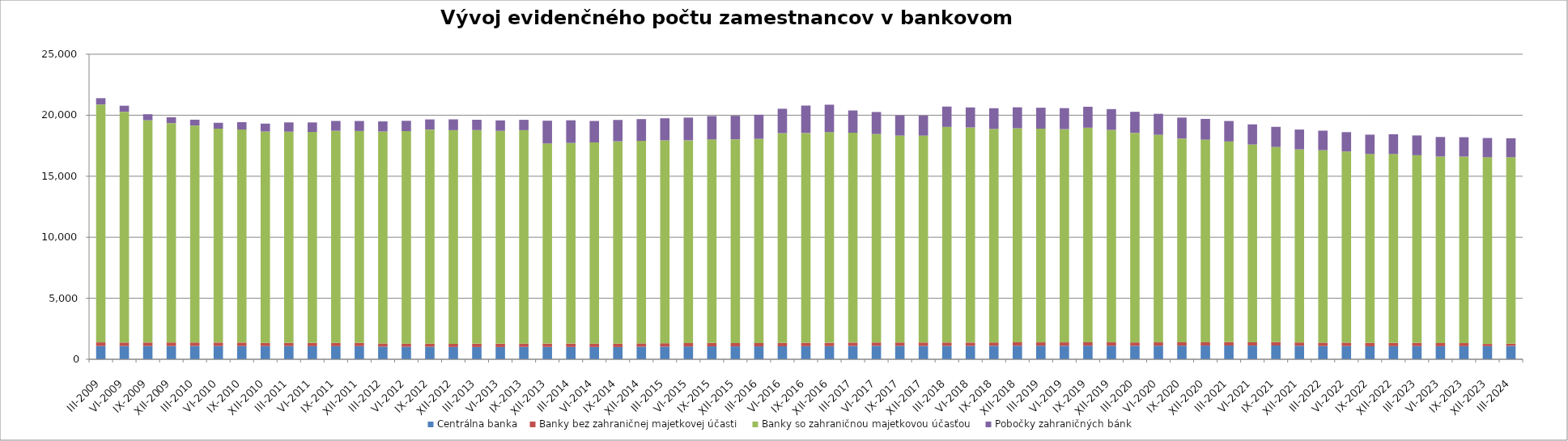
| Category | Centrálna banka  | Banky bez zahraničnej majetkovej účasti  | Banky so zahraničnou majetkovou účasťou  | Pobočky zahraničných bánk  |
|---|---|---|---|---|
| III-2009 | 1084 | 301 | 19495 | 518 |
| VI-2009 | 1086 | 286 | 18910 | 498 |
| IX-2009 | 1088 | 285 | 18218 | 490 |
| XII-2009 | 1086 | 291 | 17975 | 484 |
| III-2010 | 1089 | 286 | 17776 | 483 |
| VI-2010 | 1085 | 284 | 17526 | 485 |
| IX-2010 | 1083 | 285 | 17461 | 600 |
| XII-2010 | 1079 | 264 | 17323 | 647 |
| III-2011 | 1082 | 261 | 17308 | 760 |
| VI-2011 | 1070 | 267 | 17294 | 779 |
| IX-2011 | 1072 | 270 | 17382 | 807 |
| XII-2011 | 1075 | 267 | 17366 | 819 |
| III-2012 | 1033 | 265 | 17369 | 827 |
| VI-2012 | 1020 | 263 | 17416 | 843 |
| IX-2012 | 1021 | 257 | 17545 | 833 |
| XII-2012 | 1007 | 253 | 17516 | 886 |
| III-2013 | 1003 | 268 | 17511 | 846 |
| VI-2013 | 1001 | 268 | 17451 | 856 |
| IX-2013 | 1013 | 271 | 17492 | 847 |
| XII-2013 | 1011 | 275 | 16399 | 1866 |
| III-2014 | 1008 | 277 | 16442 | 1857 |
| VI-2014 | 1007 | 273 | 16492 | 1758 |
| IX-2014 | 1001 | 277 | 16584 | 1751 |
| XII-2014 | 1027 | 274 | 16596 | 1786 |
| III-2015 | 1034 | 280 | 16627 | 1811 |
| VI-2015 | 1049 | 279 | 16615 | 1862 |
| IX-2015 | 1056 | 280 | 16680 | 1915 |
| XII-2015 | 1053 | 277 | 16696 | 1927 |
| III-2016 | 1055 | 277 | 16734 | 1973 |
| VI-2016 | 1063 | 279 | 17191 | 1999 |
| IX-2016 | 1072 | 284 | 17186 | 2249 |
| XII-2016 | 1075 | 277 | 17261 | 2250 |
| III-2017 | 1094 | 275 | 17199 | 1821 |
| VI-2017 | 1102 | 275 | 17084 | 1803 |
| IX-2017 | 1101 | 276 | 16954 | 1662 |
| XII-2017 | 1093 | 282 | 16953 | 1644 |
| III-2018 | 1097 | 277 | 17670 | 1665 |
| VI-2018 | 1097 | 272 | 17628 | 1641 |
| IX-2018 | 1102 | 277 | 17500 | 1694 |
| XII-2018 | 1110 | 281 | 17539 | 1719 |
| III-2019 | 1111 | 276 | 17509 | 1719 |
| VI-2019 | 1105 | 280 | 17472 | 1724 |
| IX-2019 | 1114 | 279 | 17585 | 1717 |
| XII-2019 | 1109 | 280 | 17407 | 1706 |
| III-2020 | 1105 | 278 | 17174 | 1722 |
| VI-2020 | 1109 | 279 | 17008 | 1720 |
| IX-2020 | 1112 | 279 | 16701 | 1715 |
| XII-2020 | 1122 | 277 | 16599 | 1700 |
| III-2021 | 1125 | 277 | 16444 | 1679 |
| VI-2021 | 1120 | 276 | 16206 | 1649 |
| IX-2021 | 1128 | 277 | 15995 | 1649 |
| XII-2021 | 1108 | 272 | 15818 | 1627 |
| III-2022 | 1083 | 281 | 15772 | 1600 |
| VI-2022 | 1082 | 284 | 15661 | 1588 |
| IX-2022 | 1064 | 279 | 15478 | 1587 |
| XII-2022 | 1070 | 270 | 15481 | 1621 |
| III-2023 | 1076 | 264 | 15381 | 1621 |
| VI-2023 | 1069 | 256 | 15288 | 1604 |
| IX-2023 | 1072 | 252 | 15288 | 1586 |
| XII-2023 | 1073 | 181 | 15301 | 1577 |
| III-2024 | 1095 | 178 | 15283 | 1557 |